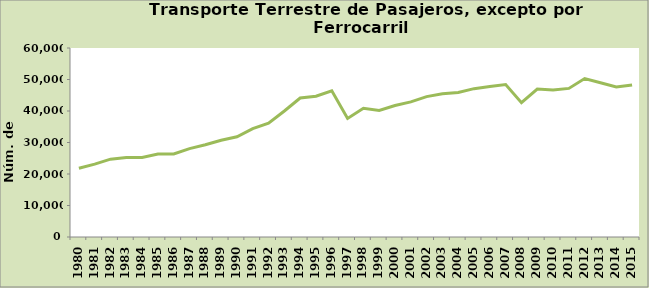
| Category | Series 0 |
|---|---|
| 1980.0 | 21840 |
| 1981.0 | 23120 |
| 1982.0 | 24701 |
| 1983.0 | 25225 |
| 1984.0 | 25268 |
| 1985.0 | 26316 |
| 1986.0 | 26382 |
| 1987.0 | 28073 |
| 1988.0 | 29279 |
| 1989.0 | 30735 |
| 1990.0 | 31811 |
| 1991.0 | 34380 |
| 1992.0 | 36140 |
| 1993.0 | 39997 |
| 1994.0 | 44109 |
| 1995.0 | 44711 |
| 1996.0 | 46427 |
| 1997.0 | 37643 |
| 1998.0 | 40846 |
| 1999.0 | 40197 |
| 2000.0 | 41758 |
| 2001.0 | 42899 |
| 2002.0 | 44573 |
| 2003.0 | 45485 |
| 2004.0 | 45906 |
| 2005.0 | 47092 |
| 2006.0 | 47751 |
| 2007.0 | 48374 |
| 2008.0 | 42648 |
| 2009.0 | 46948 |
| 2010.0 | 46658 |
| 2011.0 | 47172 |
| 2012.0 | 50312 |
| 2013.0 | 48981 |
| 2014.0 | 47610 |
| 2015.0 | 48287 |